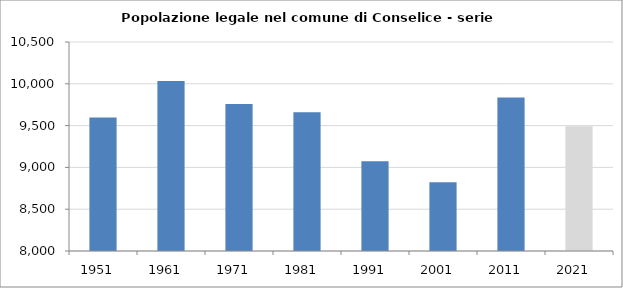
| Category | Popolazione residente |
|---|---|
| 1951   | 9598 |
| 1961   | 10033 |
| 1971   | 9758 |
| 1981   | 9660 |
| 1991   | 9075 |
| 2001   | 8822 |
| 2011   | 9837 |
| 2021   | 9491 |